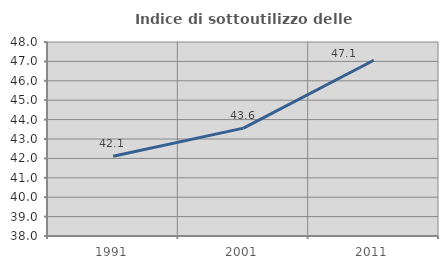
| Category | Indice di sottoutilizzo delle abitazioni  |
|---|---|
| 1991.0 | 42.115 |
| 2001.0 | 43.559 |
| 2011.0 | 47.059 |